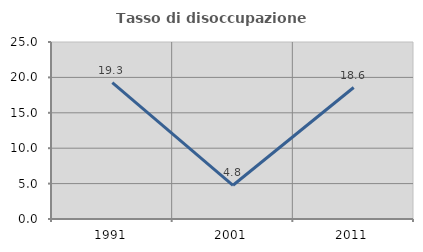
| Category | Tasso di disoccupazione giovanile  |
|---|---|
| 1991.0 | 19.266 |
| 2001.0 | 4.762 |
| 2011.0 | 18.571 |